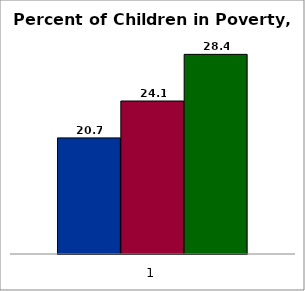
| Category | 50 states and D.C. | SREB states3 | Series 2 |
|---|---|---|---|
| 0 | 20.7 | 24.1 | 28.4 |